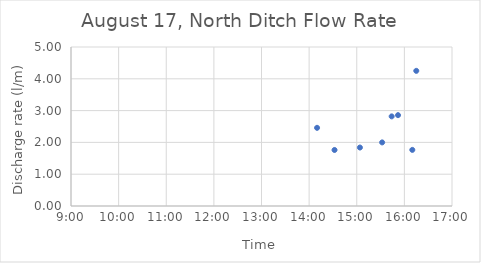
| Category | Series 0 |
|---|---|
| 0.5902777777777778 | 2.458 |
| 0.6055555555555555 | 1.762 |
| 0.6277777777777778 | 1.839 |
| 0.6472222222222223 | 2 |
| 0.6555555555555556 | 2.818 |
| 0.6611111111111111 | 2.857 |
| 0.6736111111111112 | 1.765 |
| 0.6770833333333334 | 4.25 |